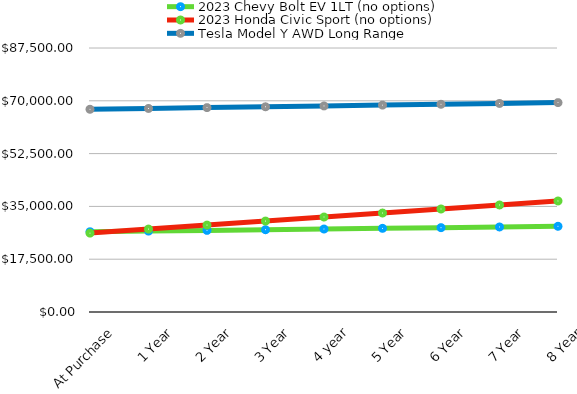
| Category | 2023 Chevy Bolt EV 1LT (no options) | 2023 Honda Civic Sport (no options) | Tesla Model Y AWD Long Range |
|---|---|---|---|
| At Purchase | 26595 | 26145 | 67190 |
| 1 Year | 26821.397 | 27476.844 | 67466.397 |
| 2 Year | 27047.794 | 28808.687 | 67742.794 |
| 3 Year | 27274.19 | 30140.531 | 68019.19 |
| 4 year | 27500.587 | 31472.375 | 68295.587 |
| 5 Year | 27726.984 | 32804.218 | 68571.984 |
| 6 Year | 27953.381 | 34136.062 | 68848.381 |
| 7 Year | 28179.778 | 35467.905 | 69124.778 |
| 8 Year | 28406.174 | 36799.749 | 69401.174 |